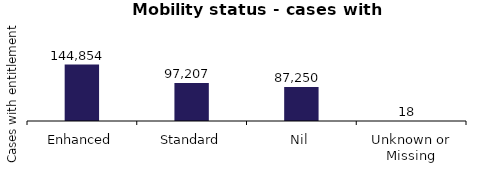
| Category | Number with Entitlement |
|---|---|
| Enhanced | 144854 |
| Standard | 97207 |
| Nil | 87250 |
| Unknown or Missing | 18 |